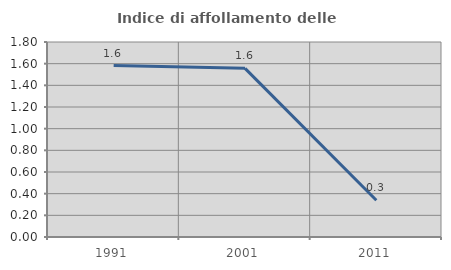
| Category | Indice di affollamento delle abitazioni  |
|---|---|
| 1991.0 | 1.583 |
| 2001.0 | 1.557 |
| 2011.0 | 0.339 |